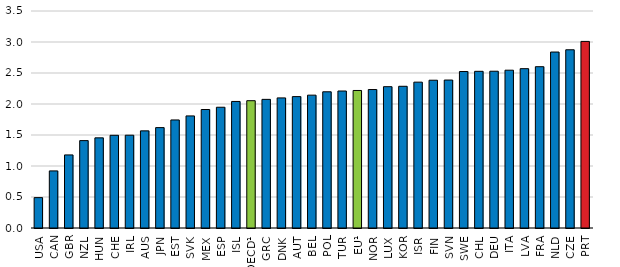
| Category | 2013 |
|---|---|
| USA | 0.49 |
| CAN | 0.921 |
| GBR | 1.179 |
| NZL | 1.41 |
| HUN | 1.454 |
| CHE | 1.495 |
| IRL | 1.497 |
| AUS | 1.567 |
| JPN | 1.619 |
| EST | 1.743 |
| SVK | 1.808 |
| MEX | 1.911 |
| ESP | 1.948 |
| ISL | 2.041 |
| OECD¹ | 2.053 |
| GRC | 2.075 |
| DNK | 2.098 |
| AUT | 2.119 |
| BEL | 2.143 |
| POL | 2.197 |
| TUR | 2.21 |
| EU¹ | 2.218 |
| NOR | 2.233 |
| LUX | 2.279 |
| KOR | 2.286 |
| ISR | 2.352 |
| FIN | 2.383 |
| SVN | 2.387 |
| SWE | 2.524 |
| CHL | 2.527 |
| DEU | 2.529 |
| ITA | 2.545 |
| LVA | 2.57 |
| FRA | 2.602 |
| NLD | 2.838 |
| CZE | 2.875 |
| PRT | 3.01 |